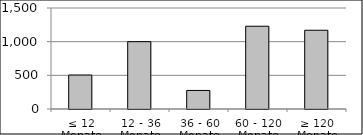
| Category | Volumen |
|---|---|
| ≤ 12 Monate | 504480845.69 |
| 12 - 36 Monate | 999958999.23 |
| 36 - 60 Monate | 275581943.58 |
| 60 - 120 Monate | 1229048121.442 |
| ≥ 120 Monate | 1169756434.844 |